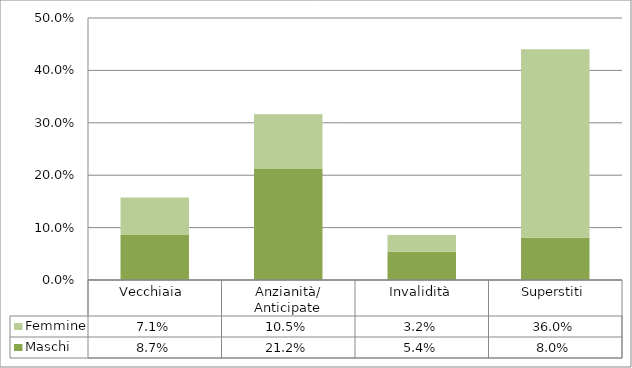
| Category | Maschi | Femmine |
|---|---|---|
| Vecchiaia  | 0.087 | 0.071 |
| Anzianità/ Anticipate | 0.212 | 0.105 |
| Invalidità | 0.054 | 0.032 |
| Superstiti | 0.08 | 0.36 |